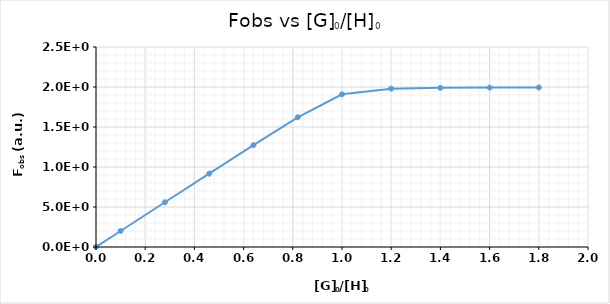
| Category | Series 0 |
|---|---|
| 0.0 | 1000 |
| 0.1 | 200411.569 |
| 0.28 | 559013.091 |
| 0.46 | 916813.256 |
| 0.6400000000000001 | 1272653.566 |
| 0.8200000000000001 | 1621319.48 |
| 1.0 | 1908309.658 |
| 1.2 | 1979264.808 |
| 1.4 | 1989186.252 |
| 1.5999999999999999 | 1992724.468 |
| 1.7999999999999998 | 1994524.042 |